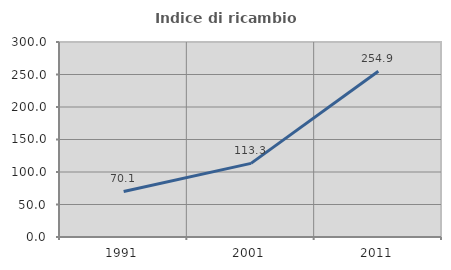
| Category | Indice di ricambio occupazionale  |
|---|---|
| 1991.0 | 70.088 |
| 2001.0 | 113.311 |
| 2011.0 | 254.902 |